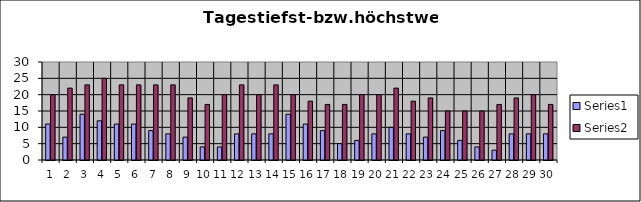
| Category | Series 0 | Series 1 |
|---|---|---|
| 0 | 11 | 20 |
| 1 | 7 | 22 |
| 2 | 14 | 23 |
| 3 | 12 | 25 |
| 4 | 11 | 23 |
| 5 | 11 | 23 |
| 6 | 9 | 23 |
| 7 | 8 | 23 |
| 8 | 7 | 19 |
| 9 | 4 | 17 |
| 10 | 4 | 20 |
| 11 | 8 | 23 |
| 12 | 8 | 20 |
| 13 | 8 | 23 |
| 14 | 14 | 20 |
| 15 | 11 | 18 |
| 16 | 9 | 17 |
| 17 | 5 | 17 |
| 18 | 6 | 20 |
| 19 | 8 | 20 |
| 20 | 10 | 22 |
| 21 | 8 | 18 |
| 22 | 7 | 19 |
| 23 | 9 | 15 |
| 24 | 6 | 15 |
| 25 | 4 | 15 |
| 26 | 3 | 17 |
| 27 | 8 | 19 |
| 28 | 8 | 20 |
| 29 | 8 | 17 |